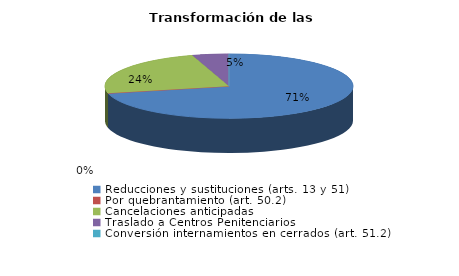
| Category | Series 0 |
|---|---|
| Reducciones y sustituciones (arts. 13 y 51) | 15 |
| Por quebrantamiento (art. 50.2) | 0 |
| Cancelaciones anticipadas | 5 |
| Traslado a Centros Penitenciarios | 1 |
| Conversión internamientos en cerrados (art. 51.2) | 0 |